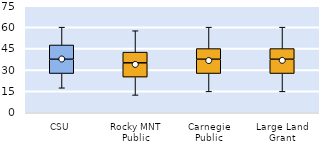
| Category | 25th | 50th | 75th |
|---|---|---|---|
| CSU | 27.5 | 10 | 10 |
| Rocky MNT Public | 25 | 10 | 7.5 |
| Carnegie Public | 27.5 | 10 | 7.5 |
| Large Land Grant | 27.5 | 10 | 7.5 |